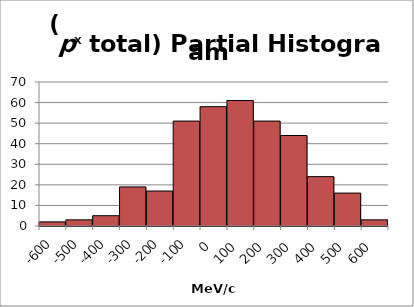
| Category | Series 1 |
|---|---|
| -600.0 | 2 |
| -500.0 | 3 |
| -400.0 | 5 |
| -300.0 | 19 |
| -200.0 | 17 |
| -100.0 | 51 |
| 0.0 | 58 |
| 100.0 | 61 |
| 200.0 | 51 |
| 300.0 | 44 |
| 400.0 | 24 |
| 500.0 | 16 |
| 600.0 | 3 |